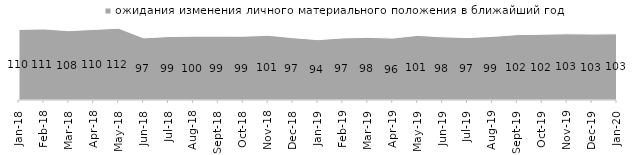
| Category | ожидания изменения личного материального положения в ближайший год |
|---|---|
| 2018-01-01 | 110.05 |
| 2018-02-01 | 110.65 |
| 2018-03-01 | 108 |
| 2018-04-01 | 109.95 |
| 2018-05-01 | 111.8 |
| 2018-06-01 | 96.75 |
| 2018-07-01 | 98.85 |
| 2018-08-01 | 99.5 |
| 2018-09-01 | 99.45 |
| 2018-10-01 | 99.4 |
| 2018-11-01 | 100.848 |
| 2018-12-01 | 97.05 |
| 2019-01-01 | 94.05 |
| 2019-02-01 | 96.75 |
| 2019-03-01 | 97.663 |
| 2019-04-01 | 96.436 |
| 2019-05-01 | 100.693 |
| 2019-06-01 | 98.404 |
| 2019-07-01 | 97.228 |
| 2019-08-01 | 99.151 |
| 2019-09-01 | 101.881 |
| 2019-10-01 | 102.475 |
| 2019-11-01 | 103.218 |
| 2019-12-01 | 102.772 |
| 2020-01-01 | 103.119 |